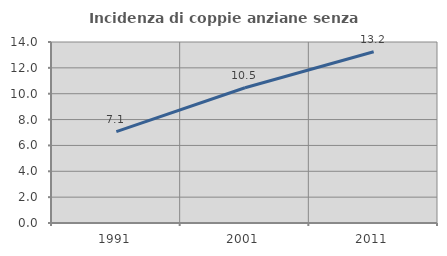
| Category | Incidenza di coppie anziane senza figli  |
|---|---|
| 1991.0 | 7.065 |
| 2001.0 | 10.458 |
| 2011.0 | 13.244 |